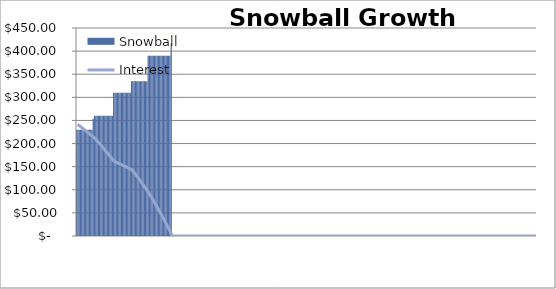
| Category | Snowball |
|---|---|
| 2015-02-01 | 230 |
| 2015-03-01 | 230 |
| 2015-04-01 | 230 |
| 2015-05-01 | 230 |
| 2015-06-01 | 230 |
| 2015-07-01 | 230 |
| 2015-08-01 | 230 |
| 2015-09-01 | 230 |
| 2015-10-01 | 230 |
| 2015-11-01 | 230 |
| 2015-12-01 | 230 |
| 2016-01-01 | 230 |
| 2016-02-01 | 230 |
| 2016-03-01 | 253.55 |
| 2016-04-01 | 260 |
| 2016-05-01 | 260 |
| 2016-06-01 | 260 |
| 2016-07-01 | 260 |
| 2016-08-01 | 260 |
| 2016-09-01 | 260 |
| 2016-10-01 | 260 |
| 2016-11-01 | 260 |
| 2016-12-01 | 260 |
| 2017-01-01 | 260 |
| 2017-02-01 | 260 |
| 2017-03-01 | 260 |
| 2017-04-01 | 260 |
| 2017-05-01 | 260 |
| 2017-06-01 | 260 |
| 2017-07-01 | 310 |
| 2017-08-01 | 310 |
| 2017-09-01 | 310 |
| 2017-10-01 | 310 |
| 2017-11-01 | 310 |
| 2017-12-01 | 310 |
| 2018-01-01 | 310 |
| 2018-02-01 | 310 |
| 2018-03-01 | 310 |
| 2018-04-01 | 310 |
| 2018-05-01 | 310 |
| 2018-06-01 | 310 |
| 2018-07-01 | 310 |
| 2018-08-01 | 310 |
| 2018-09-01 | 335 |
| 2018-10-01 | 335 |
| 2018-11-01 | 335 |
| 2018-12-01 | 335 |
| 2019-01-01 | 335 |
| 2019-02-01 | 335 |
| 2019-03-01 | 335 |
| 2019-04-01 | 335 |
| 2019-05-01 | 335 |
| 2019-06-01 | 335 |
| 2019-07-01 | 335 |
| 2019-08-01 | 335 |
| 2019-09-01 | 335 |
| 2019-10-01 | 390 |
| 2019-11-01 | 390 |
| 2019-12-01 | 390 |
| 2020-01-01 | 390 |
| 2020-02-01 | 390 |
| 2020-03-01 | 390 |
| 2020-04-01 | 390 |
| 2020-05-01 | 390 |
| 2020-06-01 | 390 |
| 2020-07-01 | 390 |
| 2020-08-01 | 390 |
| 2020-09-01 | 390 |
| 2020-10-01 | 390 |
| 2020-11-01 | 390 |
| 2020-12-01 | 390 |
| 2021-01-01 | 390 |
| 2021-02-01 | 390 |
| 2021-03-01 | 390 |
| 2021-04-01 | 416.05 |
| #N/A | 0 |
| #N/A | 0 |
| #N/A | 0 |
| #N/A | 0 |
| #N/A | 0 |
| #N/A | 0 |
| #N/A | 0 |
| #N/A | 0 |
| #N/A | 0 |
| #N/A | 0 |
| #N/A | 0 |
| #N/A | 0 |
| #N/A | 0 |
| #N/A | 0 |
| #N/A | 0 |
| #N/A | 0 |
| #N/A | 0 |
| #N/A | 0 |
| #N/A | 0 |
| #N/A | 0 |
| #N/A | 0 |
| #N/A | 0 |
| #N/A | 0 |
| #N/A | 0 |
| #N/A | 0 |
| #N/A | 0 |
| #N/A | 0 |
| #N/A | 0 |
| #N/A | 0 |
| #N/A | 0 |
| #N/A | 0 |
| #N/A | 0 |
| #N/A | 0 |
| #N/A | 0 |
| #N/A | 0 |
| #N/A | 0 |
| #N/A | 0 |
| #N/A | 0 |
| #N/A | 0 |
| #N/A | 0 |
| #N/A | 0 |
| #N/A | 0 |
| #N/A | 0 |
| #N/A | 0 |
| #N/A | 0 |
| #N/A | 0 |
| #N/A | 0 |
| #N/A | 0 |
| #N/A | 0 |
| #N/A | 0 |
| #N/A | 0 |
| #N/A | 0 |
| #N/A | 0 |
| #N/A | 0 |
| #N/A | 0 |
| #N/A | 0 |
| #N/A | 0 |
| #N/A | 0 |
| #N/A | 0 |
| #N/A | 0 |
| #N/A | 0 |
| #N/A | 0 |
| #N/A | 0 |
| #N/A | 0 |
| #N/A | 0 |
| #N/A | 0 |
| #N/A | 0 |
| #N/A | 0 |
| #N/A | 0 |
| #N/A | 0 |
| #N/A | 0 |
| #N/A | 0 |
| #N/A | 0 |
| #N/A | 0 |
| #N/A | 0 |
| #N/A | 0 |
| #N/A | 0 |
| #N/A | 0 |
| #N/A | 0 |
| #N/A | 0 |
| #N/A | 0 |
| #N/A | 0 |
| #N/A | 0 |
| #N/A | 0 |
| #N/A | 0 |
| #N/A | 0 |
| #N/A | 0 |
| #N/A | 0 |
| #N/A | 0 |
| #N/A | 0 |
| #N/A | 0 |
| #N/A | 0 |
| #N/A | 0 |
| #N/A | 0 |
| #N/A | 0 |
| #N/A | 0 |
| #N/A | 0 |
| #N/A | 0 |
| #N/A | 0 |
| #N/A | 0 |
| #N/A | 0 |
| #N/A | 0 |
| #N/A | 0 |
| #N/A | 0 |
| #N/A | 0 |
| #N/A | 0 |
| #N/A | 0 |
| #N/A | 0 |
| #N/A | 0 |
| #N/A | 0 |
| #N/A | 0 |
| #N/A | 0 |
| #N/A | 0 |
| #N/A | 0 |
| #N/A | 0 |
| #N/A | 0 |
| #N/A | 0 |
| #N/A | 0 |
| #N/A | 0 |
| #N/A | 0 |
| #N/A | 0 |
| #N/A | 0 |
| #N/A | 0 |
| #N/A | 0 |
| #N/A | 0 |
| #N/A | 0 |
| #N/A | 0 |
| #N/A | 0 |
| #N/A | 0 |
| #N/A | 0 |
| #N/A | 0 |
| #N/A | 0 |
| #N/A | 0 |
| #N/A | 0 |
| #N/A | 0 |
| #N/A | 0 |
| #N/A | 0 |
| #N/A | 0 |
| #N/A | 0 |
| #N/A | 0 |
| #N/A | 0 |
| #N/A | 0 |
| #N/A | 0 |
| #N/A | 0 |
| #N/A | 0 |
| #N/A | 0 |
| #N/A | 0 |
| #N/A | 0 |
| #N/A | 0 |
| #N/A | 0 |
| #N/A | 0 |
| #N/A | 0 |
| #N/A | 0 |
| #N/A | 0 |
| #N/A | 0 |
| #N/A | 0 |
| #N/A | 0 |
| #N/A | 0 |
| #N/A | 0 |
| #N/A | 0 |
| #N/A | 0 |
| #N/A | 0 |
| #N/A | 0 |
| #N/A | 0 |
| #N/A | 0 |
| #N/A | 0 |
| #N/A | 0 |
| #N/A | 0 |
| #N/A | 0 |
| #N/A | 0 |
| #N/A | 0 |
| #N/A | 0 |
| #N/A | 0 |
| #N/A | 0 |
| #N/A | 0 |
| #N/A | 0 |
| #N/A | 0 |
| #N/A | 0 |
| #N/A | 0 |
| #N/A | 0 |
| #N/A | 0 |
| #N/A | 0 |
| #N/A | 0 |
| #N/A | 0 |
| #N/A | 0 |
| #N/A | 0 |
| #N/A | 0 |
| #N/A | 0 |
| #N/A | 0 |
| #N/A | 0 |
| #N/A | 0 |
| #N/A | 0 |
| #N/A | 0 |
| #N/A | 0 |
| #N/A | 0 |
| #N/A | 0 |
| #N/A | 0 |
| #N/A | 0 |
| #N/A | 0 |
| #N/A | 0 |
| #N/A | 0 |
| #N/A | 0 |
| #N/A | 0 |
| #N/A | 0 |
| #N/A | 0 |
| #N/A | 0 |
| #N/A | 0 |
| #N/A | 0 |
| #N/A | 0 |
| #N/A | 0 |
| #N/A | 0 |
| #N/A | 0 |
| #N/A | 0 |
| #N/A | 0 |
| #N/A | 0 |
| #N/A | 0 |
| #N/A | 0 |
| #N/A | 0 |
| #N/A | 0 |
| #N/A | 0 |
| #N/A | 0 |
| #N/A | 0 |
| #N/A | 0 |
| #N/A | 0 |
| #N/A | 0 |
| #N/A | 0 |
| #N/A | 0 |
| #N/A | 0 |
| #N/A | 0 |
| #N/A | 0 |
| #N/A | 0 |
| #N/A | 0 |
| #N/A | 0 |
| #N/A | 0 |
| #N/A | 0 |
| #N/A | 0 |
| #N/A | 0 |
| #N/A | 0 |
| #N/A | 0 |
| #N/A | 0 |
| #N/A | 0 |
| #N/A | 0 |
| #N/A | 0 |
| #N/A | 0 |
| #N/A | 0 |
| #N/A | 0 |
| #N/A | 0 |
| #N/A | 0 |
| #N/A | 0 |
| #N/A | 0 |
| #N/A | 0 |
| #N/A | 0 |
| #N/A | 0 |
| #N/A | 0 |
| #N/A | 0 |
| #N/A | 0 |
| #N/A | 0 |
| #N/A | 0 |
| #N/A | 0 |
| #N/A | 0 |
| #N/A | 0 |
| #N/A | 0 |
| #N/A | 0 |
| #N/A | 0 |
| #N/A | 0 |
| #N/A | 0 |
| #N/A | 0 |
| #N/A | 0 |
| #N/A | 0 |
| #N/A | 0 |
| #N/A | 0 |
| #N/A | 0 |
| #N/A | 0 |
| #N/A | 0 |
| #N/A | 0 |
| #N/A | 0 |
| #N/A | 0 |
| #N/A | 0 |
| #N/A | 0 |
| #N/A | 0 |
| #N/A | 0 |
| #N/A | 0 |
| #N/A | 0 |
| #N/A | 0 |
| #N/A | 0 |